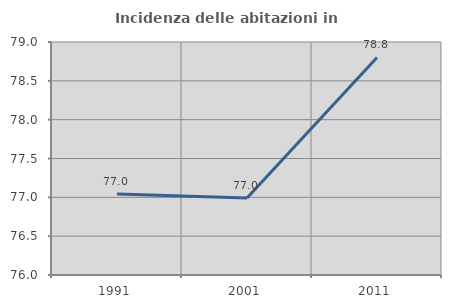
| Category | Incidenza delle abitazioni in proprietà  |
|---|---|
| 1991.0 | 77.043 |
| 2001.0 | 76.991 |
| 2011.0 | 78.801 |